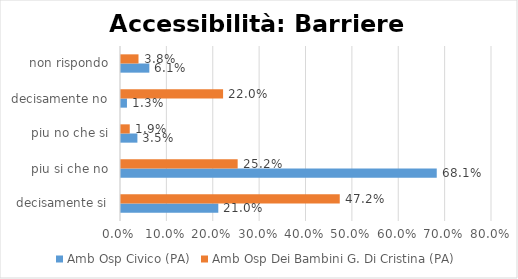
| Category | Amb Osp Civico (PA) | Amb Osp Dei Bambini G. Di Cristina (PA) |
|---|---|---|
| decisamente si | 0.21 | 0.472 |
| piu si che no | 0.681 | 0.252 |
| piu no che si | 0.035 | 0.019 |
| decisamente no | 0.013 | 0.22 |
| non rispondo | 0.061 | 0.038 |